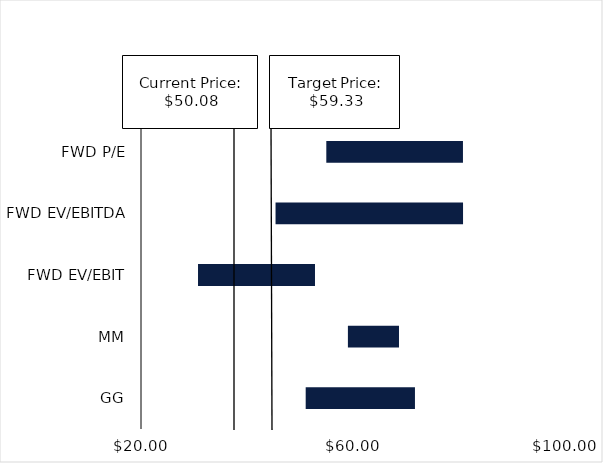
| Category | Q1 | Diff |
|---|---|---|
| GG | 51.074 | 20.617 |
| MM | 59.038 | 9.64 |
| FWD EV/EBIT | 30.757 | 22.072 |
| FWD EV/EBITDA | 45.386 | 35.377 |
| FWD P/E | 54.964 | 25.783 |